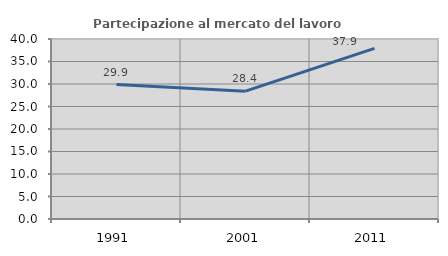
| Category | Partecipazione al mercato del lavoro  femminile |
|---|---|
| 1991.0 | 29.879 |
| 2001.0 | 28.401 |
| 2011.0 | 37.922 |